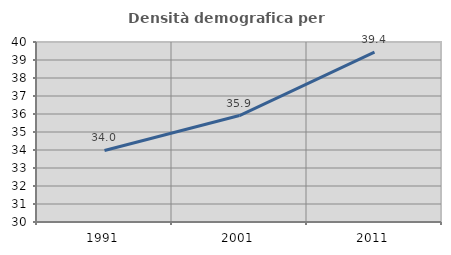
| Category | Densità demografica |
|---|---|
| 1991.0 | 33.973 |
| 2001.0 | 35.915 |
| 2011.0 | 39.443 |